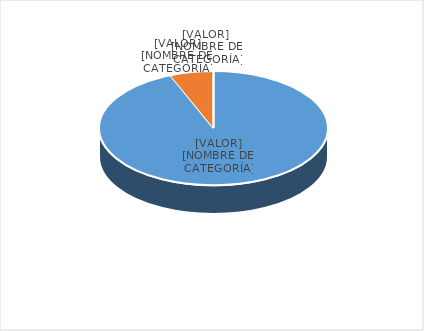
| Category | Series 0 |
|---|---|
| PRESUPUESTO VIGENTE PARA 2023 | 31000000 |
| PRESUPUESTO EJECUTADO  | 2033200.16 |
| PORCENTAJE DE EJECUCIÓN  | 0.066 |